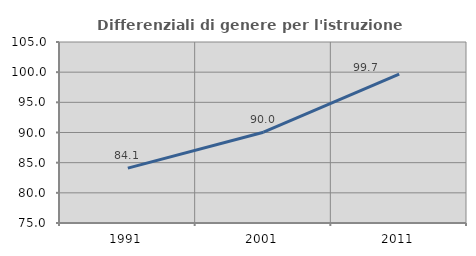
| Category | Differenziali di genere per l'istruzione superiore |
|---|---|
| 1991.0 | 84.094 |
| 2001.0 | 90.043 |
| 2011.0 | 99.676 |